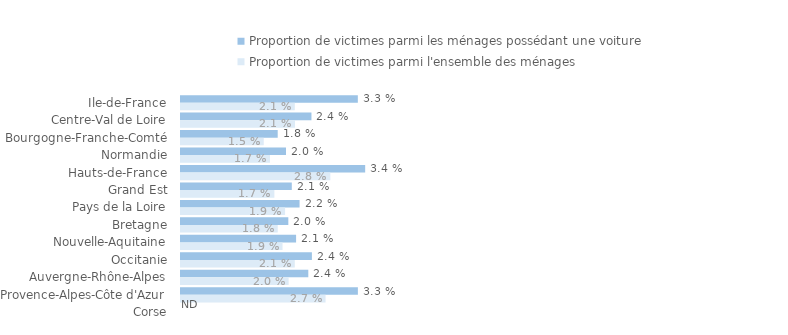
| Category | Proportion de victimes parmi les ménages possédant une voiture | Proportion de victimes parmi l'ensemble des ménages |
|---|---|---|
| Ile-de-France | 0.033 | 0.021 |
| Centre-Val de Loire | 0.024 | 0.021 |
| Bourgogne-Franche-Comté | 0.018 | 0.015 |
| Normandie | 0.02 | 0.017 |
| Hauts-de-France | 0.034 | 0.028 |
| Grand Est | 0.021 | 0.017 |
| Pays de la Loire | 0.022 | 0.019 |
| Bretagne | 0.02 | 0.018 |
| Nouvelle-Aquitaine | 0.021 | 0.019 |
| Occitanie | 0.024 | 0.021 |
| Auvergne-Rhône-Alpes | 0.024 | 0.02 |
| Provence-Alpes-Côte d'Azur | 0.033 | 0.027 |
| Corse | 0 | 0 |